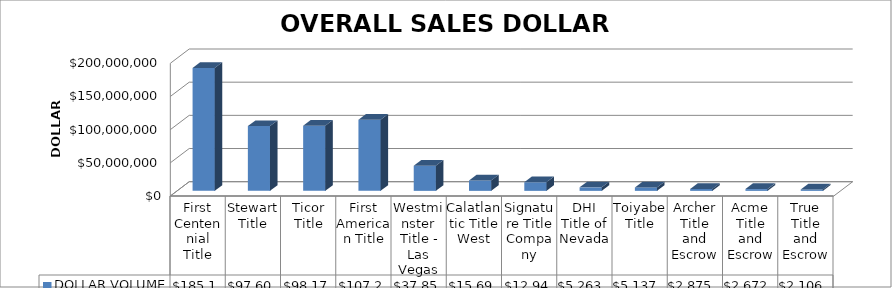
| Category | DOLLAR VOLUME |
|---|---|
| First Centennial Title | 185125067.5 |
| Stewart Title | 97606296.15 |
| Ticor Title | 98170406 |
| First American Title | 107296805.72 |
| Westminster Title - Las Vegas | 37854583 |
| Calatlantic Title West | 15691221 |
| Signature Title Company | 12940600 |
| DHI Title of Nevada | 5263135 |
| Toiyabe Title | 5137000 |
| Archer Title and Escrow | 2875427 |
| Acme Title and Escrow | 2672400 |
| True Title and Escrow | 2106700 |